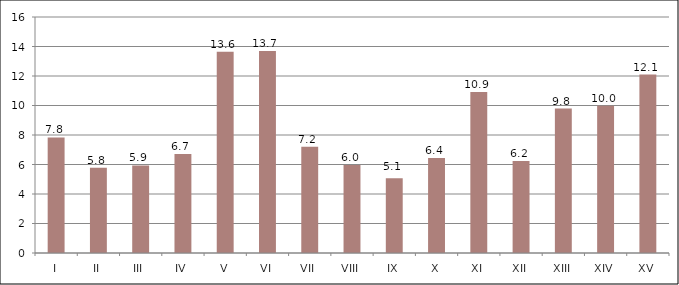
| Category | Series 0 |
|---|---|
| I | 7.832 |
| II | 5.773 |
| III | 5.937 |
| IV | 6.707 |
| V | 13.645 |
| VI | 13.702 |
| VII | 7.198 |
| VIII | 5.958 |
| IX | 5.062 |
| X | 6.443 |
| XI | 10.907 |
| XII | 6.238 |
| XIII | 9.794 |
| XIV | 9.98 |
| XV | 12.099 |